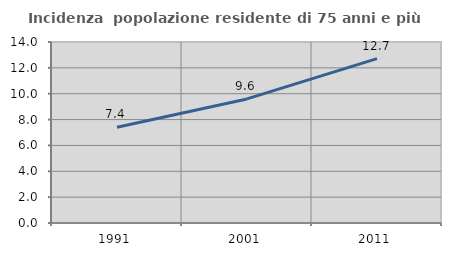
| Category | Incidenza  popolazione residente di 75 anni e più |
|---|---|
| 1991.0 | 7.401 |
| 2001.0 | 9.596 |
| 2011.0 | 12.712 |